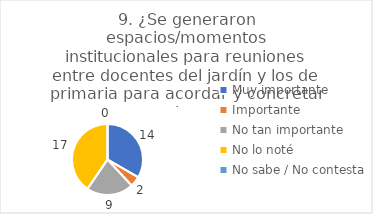
| Category | 9. ¿Se generaron espacios/momentos institucionales para reuniones entre docentes del jardín y los de primaria para acordar y concretar acciones? |
|---|---|
| Muy importante  | 0.333 |
| Importante  | 0.048 |
| No tan importante  | 0.214 |
| No lo noté  | 0.405 |
| No sabe / No contesta | 0 |